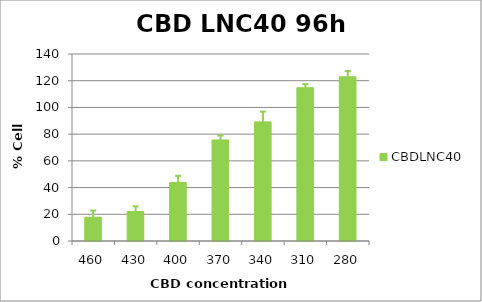
| Category | CBDLNC40 |
|---|---|
| 460.0 | 17.817 |
| 430.0 | 22.025 |
| 400.0 | 43.816 |
| 370.0 | 75.661 |
| 340.0 | 89.163 |
| 310.0 | 114.736 |
| 280.0 | 122.937 |